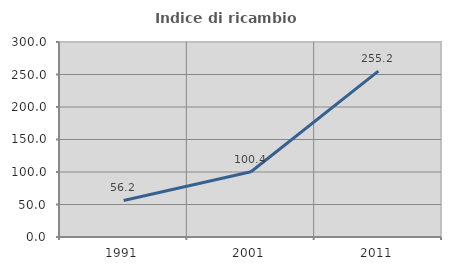
| Category | Indice di ricambio occupazionale  |
|---|---|
| 1991.0 | 56.176 |
| 2001.0 | 100.395 |
| 2011.0 | 255.152 |